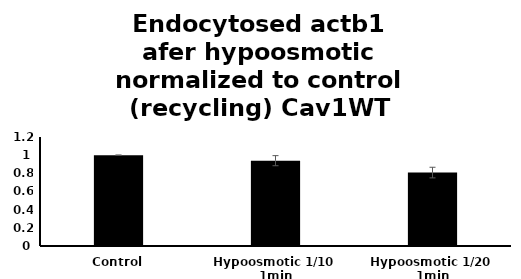
| Category | Cav1WT |
|---|---|
| Control | 1 |
| Hypoosmotic 1/10  1min | 0.939 |
| Hypoosmotic 1/20  1min | 0.808 |